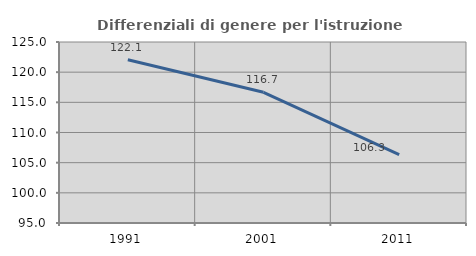
| Category | Differenziali di genere per l'istruzione superiore |
|---|---|
| 1991.0 | 122.058 |
| 2001.0 | 116.659 |
| 2011.0 | 106.335 |